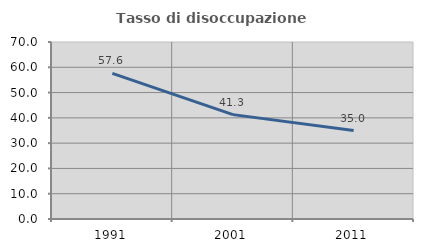
| Category | Tasso di disoccupazione giovanile  |
|---|---|
| 1991.0 | 57.623 |
| 2001.0 | 41.28 |
| 2011.0 | 34.969 |